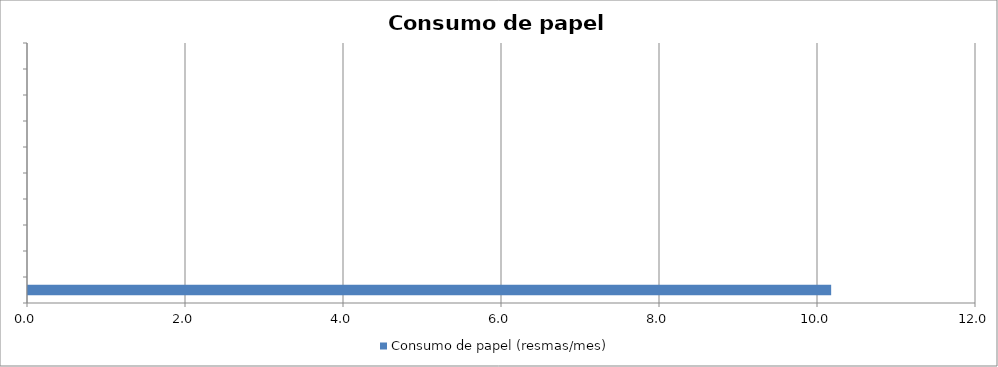
| Category | Consumo de papel (resmas/mes) |
|---|---|
| 0 | 10.167 |
| 1 | 0 |
| 2 | 0 |
| 3 | 0 |
| 4 | 0 |
| 5 | 0 |
| 6 | 0 |
| 7 | 0 |
| 8 | 0 |
| 9 | 0 |